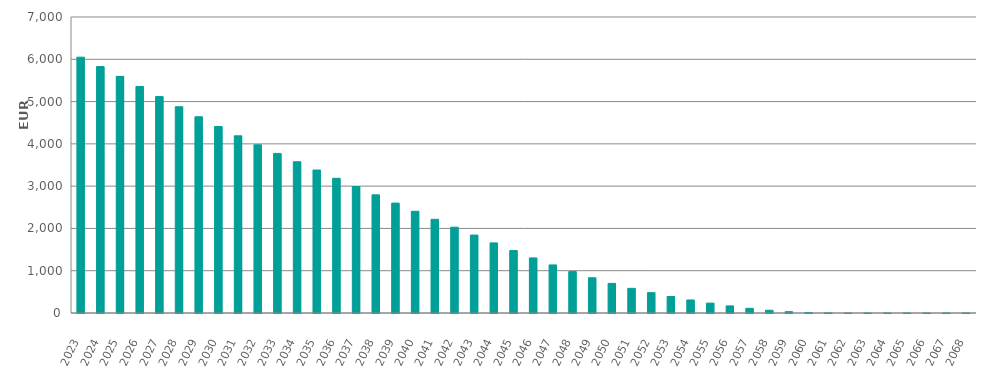
| Category | EUR Millions |
|---|---|
| 2023.0 | 6050000000 |
| 2024.0 | 5827564217.974 |
| 2025.0 | 5596041126.004 |
| 2026.0 | 5357925255.634 |
| 2027.0 | 5117706024.292 |
| 2028.0 | 4877281733.661 |
| 2029.0 | 4640142237.656 |
| 2030.0 | 4410881541.921 |
| 2031.0 | 4190134981.158 |
| 2032.0 | 3977608845.6 |
| 2033.0 | 3774178781.431 |
| 2034.0 | 3576602232.636 |
| 2035.0 | 3381207445.286 |
| 2036.0 | 3185073328.663 |
| 2037.0 | 2990142442.305 |
| 2038.0 | 2794458612.348 |
| 2039.0 | 2598569855.976 |
| 2040.0 | 2405459976.755 |
| 2041.0 | 2215736838.536 |
| 2042.0 | 2029037075.877 |
| 2043.0 | 1843045806.856 |
| 2044.0 | 1657691126.152 |
| 2045.0 | 1477467848.764 |
| 2046.0 | 1302876368.634 |
| 2047.0 | 1136496142.117 |
| 2048.0 | 979392217.668 |
| 2049.0 | 833540053.295 |
| 2050.0 | 700371638.317 |
| 2051.0 | 582748704.975 |
| 2052.0 | 481263822.722 |
| 2053.0 | 390285856.218 |
| 2054.0 | 307858964.652 |
| 2055.0 | 233547234.588 |
| 2056.0 | 167554403.391 |
| 2057.0 | 110524228.586 |
| 2058.0 | 64371695.458 |
| 2059.0 | 31321156.753 |
| 2060.0 | 11193614.857 |
| 2061.0 | 2138657.492 |
| 2062.0 | 288378.16 |
| 2063.0 | 81515.29 |
| 2064.0 | 55991.318 |
| 2065.0 | 37458.222 |
| 2066.0 | 27250.802 |
| 2067.0 | 17635.867 |
| 2068.0 | 9694.359 |